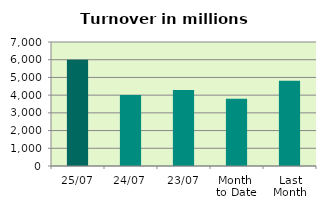
| Category | Series 0 |
|---|---|
| 25/07 | 5991.286 |
| 24/07 | 4008.9 |
| 23/07 | 4289.297 |
| Month 
to Date | 3801.483 |
| Last
Month | 4815.104 |